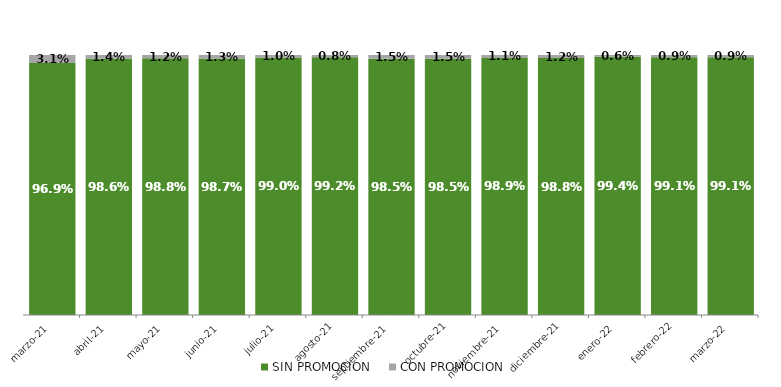
| Category | SIN PROMOCION   | CON PROMOCION   |
|---|---|---|
| 2021-03-01 | 0.969 | 0.031 |
| 2021-04-01 | 0.986 | 0.014 |
| 2021-05-01 | 0.988 | 0.012 |
| 2021-06-01 | 0.987 | 0.013 |
| 2021-07-01 | 0.99 | 0.01 |
| 2021-08-01 | 0.992 | 0.008 |
| 2021-09-01 | 0.985 | 0.015 |
| 2021-10-01 | 0.985 | 0.015 |
| 2021-11-01 | 0.989 | 0.011 |
| 2021-12-01 | 0.988 | 0.012 |
| 2022-01-01 | 0.994 | 0.006 |
| 2022-02-01 | 0.991 | 0.009 |
| 2022-03-01 | 0.991 | 0.009 |